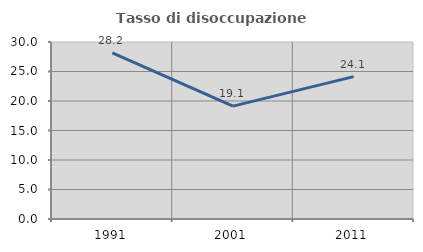
| Category | Tasso di disoccupazione giovanile  |
|---|---|
| 1991.0 | 28.15 |
| 2001.0 | 19.13 |
| 2011.0 | 24.126 |